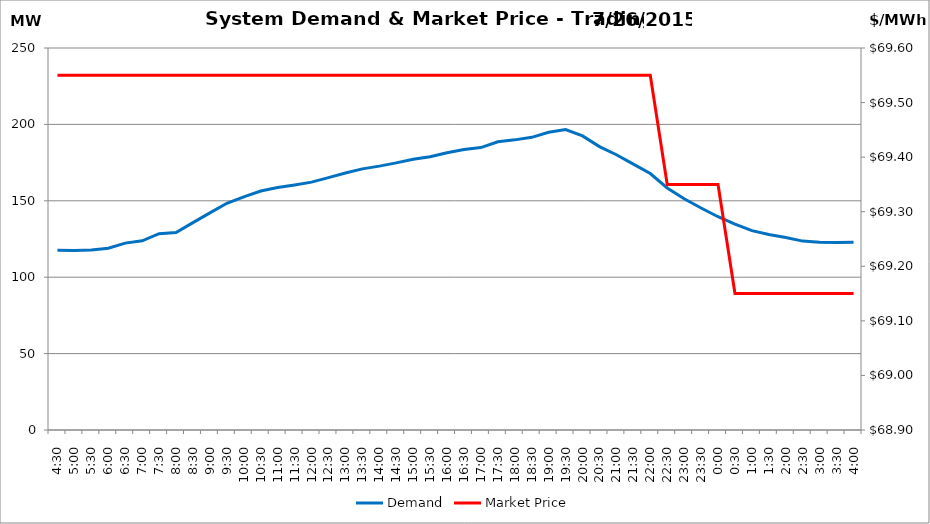
| Category | Demand |
|---|---|
| 0.1875 | 117.58 |
| 0.20833333333333334 | 117.51 |
| 0.22916666666666666 | 117.84 |
| 0.25 | 118.91 |
| 0.270833333333333 | 122.3 |
| 0.291666666666667 | 123.79 |
| 0.3125 | 128.48 |
| 0.333333333333333 | 129.25 |
| 0.354166666666667 | 135.73 |
| 0.375 | 142.11 |
| 0.395833333333333 | 148.38 |
| 0.416666666666667 | 152.55 |
| 0.4375 | 156.42 |
| 0.458333333333333 | 158.73 |
| 0.479166666666667 | 160.39 |
| 0.5 | 162.22 |
| 0.520833333333333 | 165.14 |
| 0.541666666666667 | 168.22 |
| 0.5625 | 170.89 |
| 0.583333333333333 | 172.7 |
| 0.604166666666667 | 174.81 |
| 0.625 | 177.18 |
| 0.645833333333334 | 178.83 |
| 0.666666666666667 | 181.4 |
| 0.6875 | 183.53 |
| 0.708333333333334 | 184.82 |
| 0.729166666666667 | 188.67 |
| 0.75 | 189.88 |
| 0.770833333333334 | 191.52 |
| 0.791666666666667 | 194.81 |
| 0.8125 | 196.62 |
| 0.833333333333334 | 192.48 |
| 0.854166666666667 | 185.48 |
| 0.875 | 180.16 |
| 0.895833333333334 | 174.04 |
| 0.916666666666667 | 167.85 |
| 0.9375 | 158.41 |
| 0.958333333333334 | 151.37 |
| 0.979166666666667 | 145.27 |
| 1900-01-01 | 139.56 |
| 1900-01-01 00:30:00 | 134.79 |
| 1900-01-01 01:00:00 | 130.5 |
| 1900-01-01 01:30:00 | 127.9 |
| 1900-01-01 02:00:00 | 125.99 |
| 1900-01-01 02:30:00 | 123.63 |
| 1900-01-01 03:00:00 | 122.87 |
| 1900-01-01 03:30:00 | 122.66 |
| 1900-01-01 04:00:00 | 122.8 |